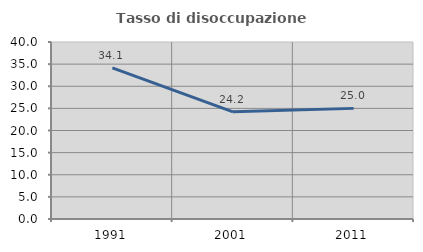
| Category | Tasso di disoccupazione giovanile  |
|---|---|
| 1991.0 | 34.135 |
| 2001.0 | 24.214 |
| 2011.0 | 25 |